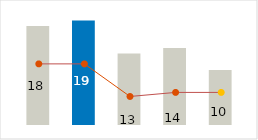
| Category | Profit |
|---|---|
| 0 | 18 |
| 1 | 19 |
| 2 | 13 |
| 3 | 14 |
| 4 | 10 |